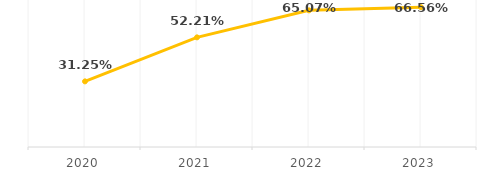
| Category | Series 0 |
|---|---|
| 2020 | 0.313 |
| 2021 | 0.522 |
| 2022 | 0.651 |
| 2023 | 0.666 |